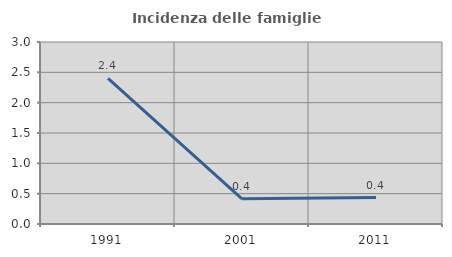
| Category | Incidenza delle famiglie numerose |
|---|---|
| 1991.0 | 2.4 |
| 2001.0 | 0.415 |
| 2011.0 | 0.435 |